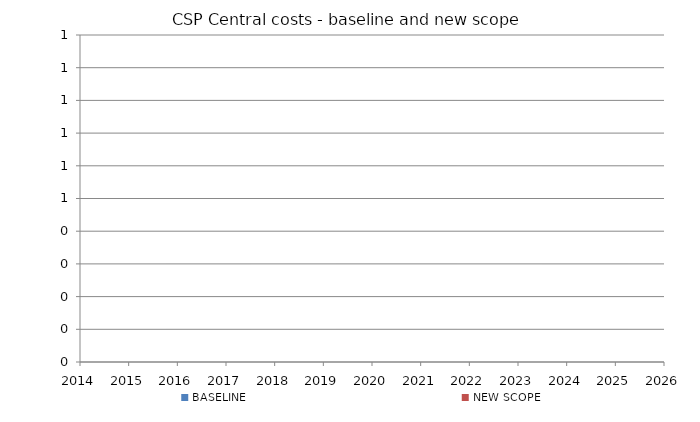
| Category | BASELINE | NEW SCOPE |
|---|---|---|
| 2014.0 | 0 | 0 |
| 2015.0 | 0 | 0 |
| 2016.0 | 0 | 0 |
| 2017.0 | 0 | 0 |
| 2018.0 | 0 | 0 |
| 2019.0 | 0 | 0 |
| 2020.0 | 0 | 0 |
| 2021.0 | 0 | 0 |
| 2022.0 | 0 | 0 |
| 2023.0 | 0 | 0 |
| 2024.0 | 0 | 0 |
| 2025.0 | 0 | 0 |
| 2026.0 | 0 | 0 |